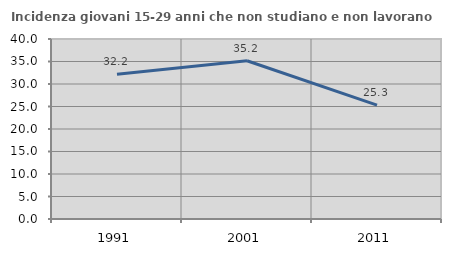
| Category | Incidenza giovani 15-29 anni che non studiano e non lavorano  |
|---|---|
| 1991.0 | 32.177 |
| 2001.0 | 35.166 |
| 2011.0 | 25.3 |